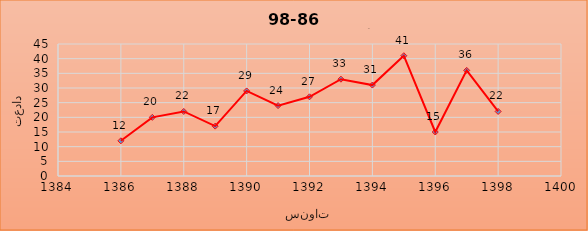
| Category | مجموع دانشگاه |
|---|---|
| 1386.0 | 12 |
| 1387.0 | 20 |
| 1388.0 | 22 |
| 1389.0 | 17 |
| 1390.0 | 29 |
| 1391.0 | 24 |
| 1392.0 | 27 |
| 1393.0 | 33 |
| 1394.0 | 31 |
| 1395.0 | 41 |
| 1396.0 | 15 |
| 1397.0 | 36 |
| 1398.0 | 22 |